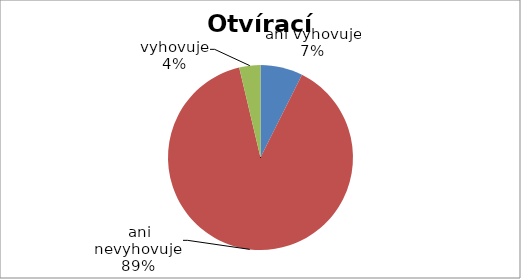
| Category | Celkem |
|---|---|
| ani vyhovuje, ani nevyhovuje | 2 |
| vyhovuje | 24 |
| nevyhovuje | 1 |